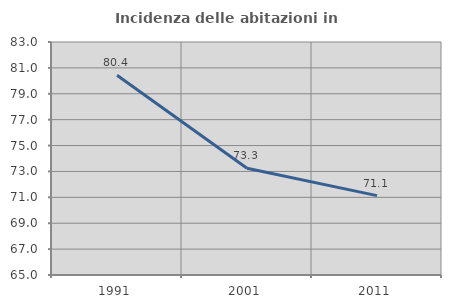
| Category | Incidenza delle abitazioni in proprietà  |
|---|---|
| 1991.0 | 80.435 |
| 2001.0 | 73.253 |
| 2011.0 | 71.133 |